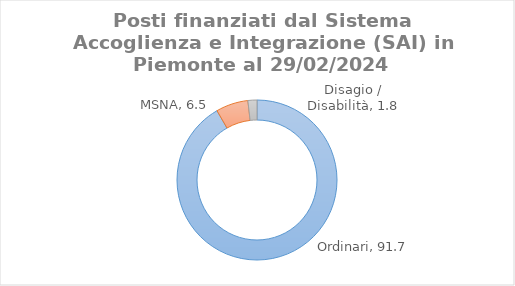
| Category | Series 0 |
|---|---|
| Ordinari | 91.673 |
| MSNA | 6.503 |
| Disagio / Disabilità | 1.824 |